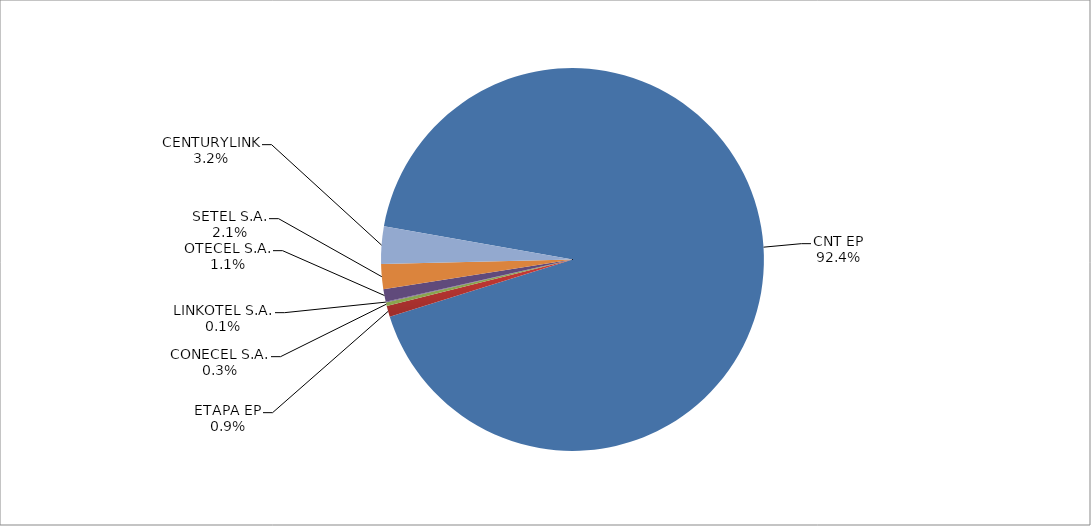
| Category | Series 0 |
|---|---|
| CNT EP | 2866 |
| ETAPA EP | 29 |
| CONECEL S.A. | 9 |
| LINKOTEL S.A. | 2 |
| OTECEL S.A. | 33 |
| SETEL S.A. | 65 |
| CENTURYLINK | 98 |